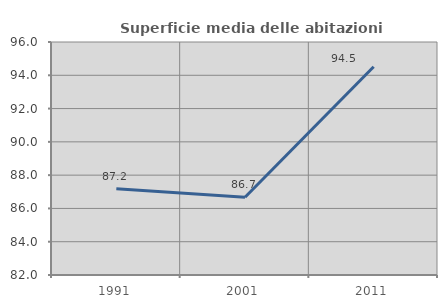
| Category | Superficie media delle abitazioni occupate |
|---|---|
| 1991.0 | 87.176 |
| 2001.0 | 86.673 |
| 2011.0 | 94.514 |